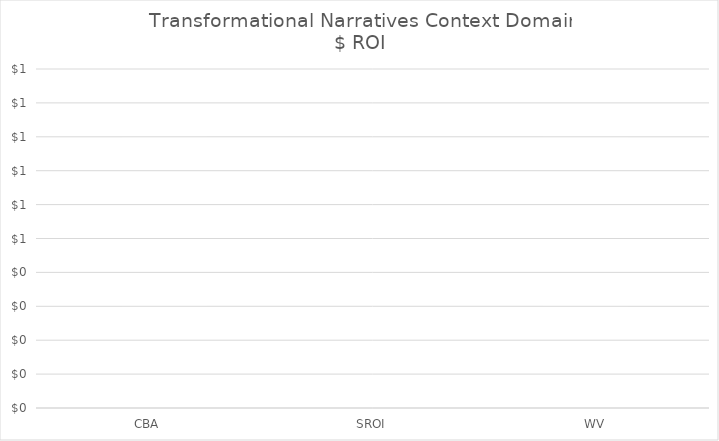
| Category | Narratives |
|---|---|
| CBA | 0 |
| SROI | 0 |
| WV | 0 |